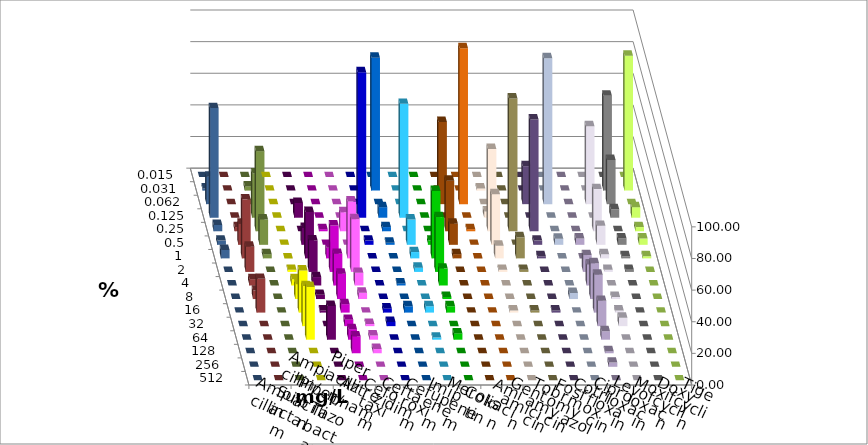
| Category | Ampicillin | Ampicillin/ Sulbactam | Piperacillin | Piperacillin/ Tazobactam | Aztreonam | Cefotaxim | Ceftazidim | Cefuroxim | Imipenem | Meropenem | Colistin | Amikacin | Gentamicin | Tobramycin | Fosfomycin | Cotrimoxazol | Ciprofloxacin | Levofloxacin | Moxifloxacin | Doxycyclin | Tigecyclin |
|---|---|---|---|---|---|---|---|---|---|---|---|---|---|---|---|---|---|---|---|---|---|
| 0.015 | 0 | 0 | 0 | 0 | 0 | 0 | 0 | 0 | 0 | 0 | 0 | 0 | 0 | 0 | 0 | 0 | 0 | 0 | 0 | 0 | 0 |
| 0.031 | 0 | 0 | 0 | 0 | 0 | 84 | 0 | 0 | 0 | 0 | 1.333 | 0 | 0 | 0 | 0 | 0 | 60 | 85.333 | 1.333 | 0 | 2.667 |
| 0.062 | 0 | 0 | 0 | 0 | 0 | 0 | 0 | 0 | 52 | 98.667 | 0 | 0 | 24 | 92.308 | 0 | 49.333 | 28 | 0 | 17.333 | 0 | 0 |
| 0.125 | 0 | 9.333 | 0 | 0 | 92 | 6.667 | 72 | 0 | 0 | 0 | 4 | 0 | 0 | 0 | 0 | 0 | 5.333 | 6.667 | 69.333 | 0 | 28 |
| 0.25 | 0 | 0 | 1.333 | 12 | 0 | 2.667 | 0 | 0 | 32 | 1.333 | 52 | 84 | 70.667 | 0 | 0 | 26.667 | 0 | 2.667 | 4 | 2.667 | 50.667 |
| 0.5 | 0 | 10.667 | 0 | 0 | 2.667 | 1.333 | 16 | 2.667 | 13.333 | 0 | 32 | 0 | 2.667 | 3.846 | 4 | 12 | 4 | 4 | 2.667 | 13.333 | 16 |
| 1.0 | 0 | 29.333 | 6.667 | 36 | 0 | 0 | 4 | 42.667 | 2.667 | 0 | 8 | 13.333 | 1.333 | 0 | 0 | 2.667 | 1.333 | 1.333 | 5.333 | 37.333 | 2.667 |
| 2.0 | 1.333 | 20 | 29.333 | 33.333 | 0 | 0 | 2.667 | 34.667 | 0 | 0 | 1.333 | 1.333 | 0 | 0 | 10.667 | 1.333 | 1.333 | 0 | 0 | 16 | 0 |
| 4.0 | 4 | 5.333 | 20 | 8 | 0 | 1.333 | 0 | 10.667 | 0 | 0 | 0 | 0 | 0 | 0 | 13.333 | 0 | 0 | 0 | 0 | 4 | 0 |
| 8.0 | 9.333 | 2.667 | 16 | 4 | 0 | 0 | 0 | 1.333 | 0 | 0 | 0 | 0 | 0 | 3.846 | 22.667 | 1.333 | 0 | 0 | 0 | 5.333 | 0 |
| 16.0 | 26.667 | 1.333 | 5.333 | 0 | 2.667 | 4 | 4 | 4 | 0 | 0 | 1.333 | 1.333 | 1.333 | 0 | 24 | 1.333 | 0 | 0 | 0 | 21.333 | 0 |
| 32.0 | 25.333 | 0 | 4 | 1.333 | 2.667 | 0 | 0 | 0 | 0 | 0 | 0 | 0 | 0 | 0 | 16 | 5.333 | 0 | 0 | 0 | 0 | 0 |
| 64.0 | 33.333 | 21.333 | 6.667 | 2.667 | 0 | 0 | 1.333 | 4 | 0 | 0 | 0 | 0 | 0 | 0 | 5.333 | 0 | 0 | 0 | 0 | 0 | 0 |
| 128.0 | 0 | 0 | 10.667 | 2.667 | 0 | 0 | 0 | 0 | 0 | 0 | 0 | 0 | 0 | 0 | 1.333 | 0 | 0 | 0 | 0 | 0 | 0 |
| 256.0 | 0 | 0 | 0 | 0 | 0 | 0 | 0 | 0 | 0 | 0 | 0 | 0 | 0 | 0 | 2.667 | 0 | 0 | 0 | 0 | 0 | 0 |
| 512.0 | 0 | 0 | 0 | 0 | 0 | 0 | 0 | 0 | 0 | 0 | 0 | 0 | 0 | 0 | 0 | 0 | 0 | 0 | 0 | 0 | 0 |